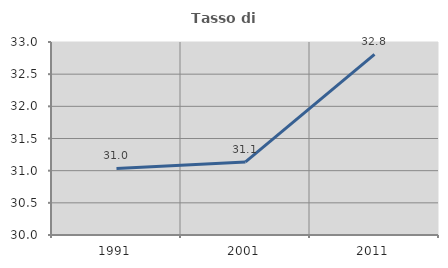
| Category | Tasso di occupazione   |
|---|---|
| 1991.0 | 31.034 |
| 2001.0 | 31.136 |
| 2011.0 | 32.808 |